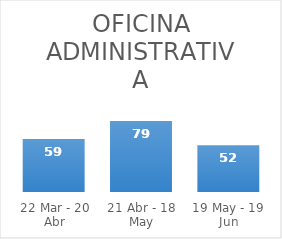
| Category | Series 0 |
|---|---|
| 22 Mar - 20 Abr | 59 |
| 21 Abr - 18 May | 79 |
| 19 May - 19 Jun | 52 |